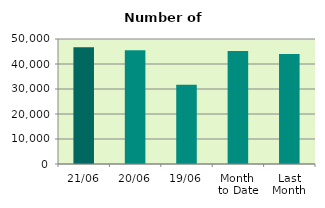
| Category | Series 0 |
|---|---|
| 21/06 | 46656 |
| 20/06 | 45528 |
| 19/06 | 31744 |
| Month 
to Date | 45242.533 |
| Last
Month | 44009.364 |